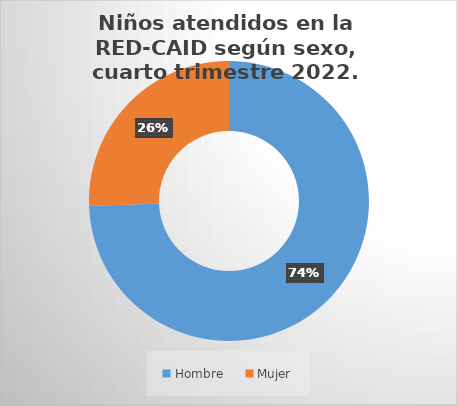
| Category | Cantidad |
|---|---|
| Hombre | 1992 |
| Mujer | 684 |